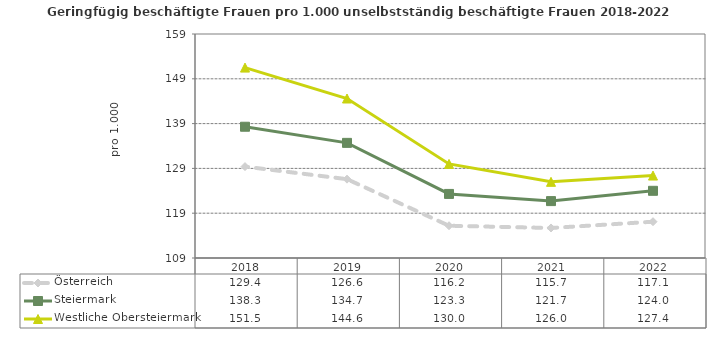
| Category | Österreich | Steiermark | Westliche Obersteiermark |
|---|---|---|---|
| 2022.0 | 117.1 | 124 | 127.4 |
| 2021.0 | 115.7 | 121.7 | 126 |
| 2020.0 | 116.2 | 123.3 | 130 |
| 2019.0 | 126.6 | 134.7 | 144.6 |
| 2018.0 | 129.4 | 138.3 | 151.5 |